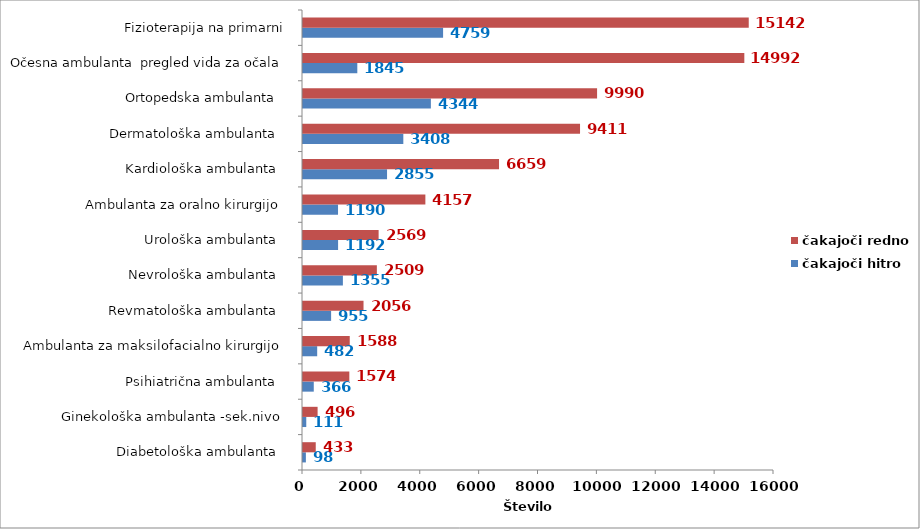
| Category | čakajoči hitro | čakajoči redno |
|---|---|---|
| Diabetološka ambulanta   | 98 | 433 |
| Ginekološka ambulanta -sek.nivo  | 111 | 496 |
| Psihiatrična ambulanta   | 366 | 1574 |
| Ambulanta za maksilofacialno kirurgijo  | 482 | 1588 |
| Revmatološka ambulanta   | 955 | 2056 |
| Nevrološka ambulanta   | 1355 | 2509 |
| Urološka ambulanta   | 1192 | 2569 |
| Ambulanta za oralno kirurgijo  | 1190 | 4157 |
| Kardiološka ambulanta   | 2855 | 6659 |
| Dermatološka ambulanta   | 3408 | 9411 |
| Ortopedska ambulanta   | 4344 | 9990 |
| Očesna ambulanta  pregled vida za očala | 1845 | 14992 |
| Fizioterapija na primarni | 4759 | 15142 |